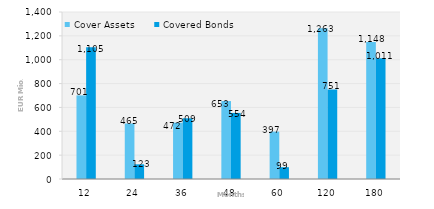
| Category | Cover Assets | Covered Bonds |
|---|---|---|
| 12.0 | 700.785 | 1105.218 |
| 24.0 | 465.162 | 123.092 |
| 36.0 | 472.116 | 509 |
| 48.0 | 653.328 | 554 |
| 60.0 | 397.364 | 99 |
| 120.0 | 1263.459 | 750.824 |
| 180.0 | 1147.615 | 1011.398 |